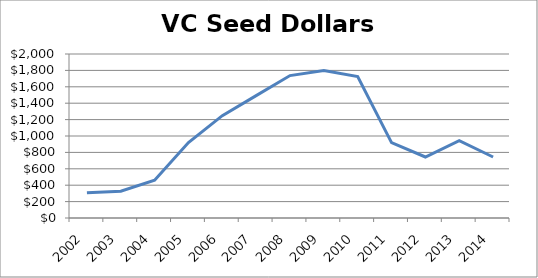
| Category | Seed Dollars |
|---|---|
| 2002.0 | 307 |
| 2003.0 | 327 |
| 2004.0 | 460 |
| 2005.0 | 921 |
| 2006.0 | 1248 |
| 2007.0 | 1492 |
| 2008.0 | 1737 |
| 2009.0 | 1798 |
| 2010.0 | 1725 |
| 2011.0 | 919 |
| 2012.0 | 744 |
| 2013.0 | 943 |
| 2014.0 | 744 |